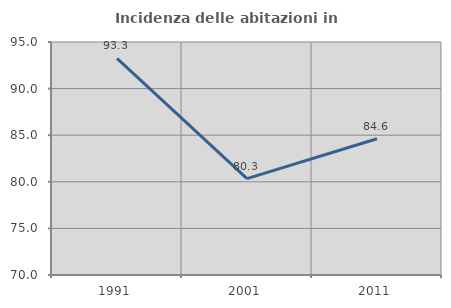
| Category | Incidenza delle abitazioni in proprietà  |
|---|---|
| 1991.0 | 93.252 |
| 2001.0 | 80.337 |
| 2011.0 | 84.615 |